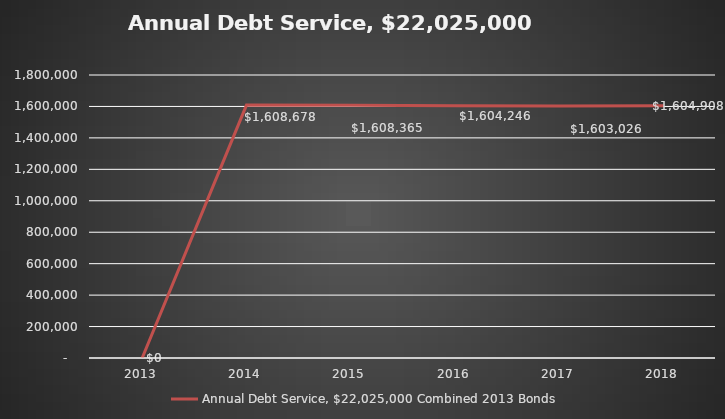
| Category | Annual Debt Service, $22,025,000 Combined 2013 Bonds |
|---|---|
| 2013.0 | 0 |
| 2014.0 | 1608678 |
| 2015.0 | 1608365 |
| 2016.0 | 1604246 |
| 2017.0 | 1603026 |
| 2018.0 | 1604908 |